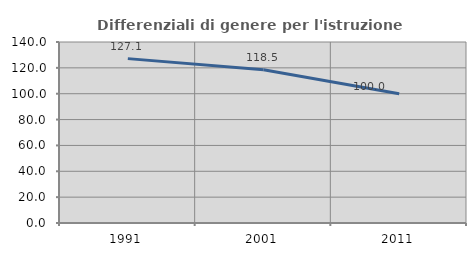
| Category | Differenziali di genere per l'istruzione superiore |
|---|---|
| 1991.0 | 127.137 |
| 2001.0 | 118.548 |
| 2011.0 | 100.009 |